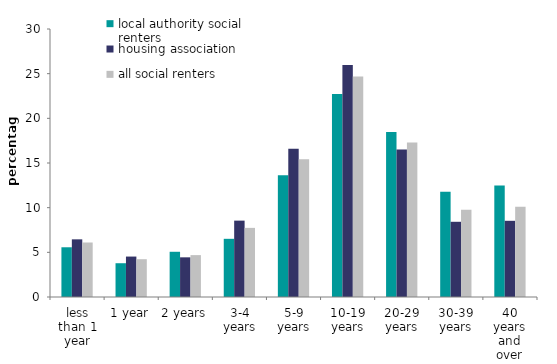
| Category | local authority | housing association | all social renters |
|---|---|---|---|
| less than 1 year | 5.566 | 6.454 | 6.101 |
| 1 year | 3.781 | 4.527 | 4.23 |
| 2 years | 5.062 | 4.441 | 4.688 |
| 3-4 years | 6.513 | 8.549 | 7.738 |
| 5-9 years | 13.631 | 16.596 | 15.415 |
| 10-19 years | 22.725 | 25.976 | 24.681 |
| 20-29 years | 18.469 | 16.509 | 17.29 |
| 30-39 years | 11.773 | 8.419 | 9.755 |
| 40 years and over | 12.479 | 8.529 | 10.102 |